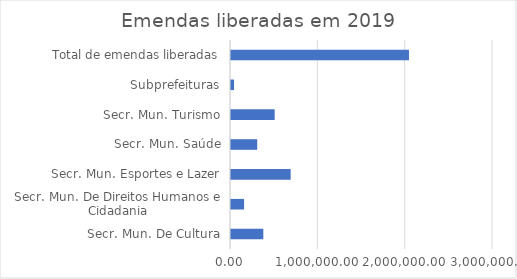
| Category | Valor |
|---|---|
| Secr. Mun. De Cultura | 370000 |
| Secr. Mun. De Direitos Humanos e Cidadania | 150000 |
| Secr. Mun. Esportes e Lazer | 683000 |
| Secr. Mun. Saúde | 300000 |
| Secr. Mun. Turismo | 500000 |
| Subprefeituras | 35000 |
| Total de emendas liberadas | 2038000 |